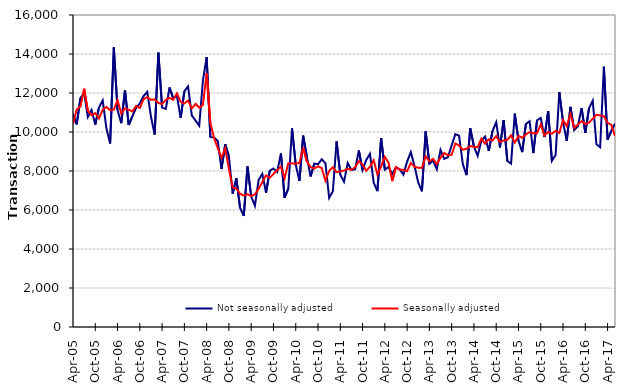
| Category | Not seasonally adjusted | Seasonally adjusted |
|---|---|---|
| 2005-04-01 | 10920 | 10410 |
| 2005-05-01 | 10390 | 11160 |
| 2005-06-01 | 11740 | 11300 |
| 2005-07-01 | 12000 | 12220 |
| 2005-08-01 | 10770 | 11090 |
| 2005-09-01 | 11130 | 10860 |
| 2005-10-01 | 10380 | 10970 |
| 2005-11-01 | 11260 | 10700 |
| 2005-12-01 | 11620 | 11140 |
| 2006-01-01 | 10190 | 11280 |
| 2006-02-01 | 9410 | 11120 |
| 2006-03-01 | 14330 | 11150 |
| 2006-04-01 | 11120 | 11630 |
| 2006-05-01 | 10450 | 10940 |
| 2006-06-01 | 12150 | 11210 |
| 2006-07-01 | 10360 | 11140 |
| 2006-08-01 | 10810 | 11050 |
| 2006-09-01 | 11230 | 11340 |
| 2006-10-01 | 11470 | 11230 |
| 2006-11-01 | 11840 | 11680 |
| 2006-12-01 | 12060 | 11790 |
| 2007-01-01 | 10790 | 11650 |
| 2007-02-01 | 9870 | 11670 |
| 2007-03-01 | 14070 | 11490 |
| 2007-04-01 | 11250 | 11430 |
| 2007-05-01 | 11180 | 11650 |
| 2007-06-01 | 12280 | 11750 |
| 2007-07-01 | 11720 | 11650 |
| 2007-08-01 | 11860 | 11980 |
| 2007-09-01 | 10720 | 11550 |
| 2007-10-01 | 12090 | 11470 |
| 2007-11-01 | 12340 | 11610 |
| 2007-12-01 | 10850 | 11210 |
| 2008-01-01 | 10590 | 11440 |
| 2008-02-01 | 10320 | 11250 |
| 2008-03-01 | 12640 | 11390 |
| 2008-04-01 | 13850 | 13010 |
| 2008-05-01 | 9750 | 10470 |
| 2008-06-01 | 9720 | 9690 |
| 2008-07-01 | 9540 | 9160 |
| 2008-08-01 | 8100 | 8680 |
| 2008-09-01 | 9380 | 9160 |
| 2008-10-01 | 8740 | 8110 |
| 2008-11-01 | 6840 | 7160 |
| 2008-12-01 | 7620 | 7100 |
| 2009-01-01 | 6110 | 6830 |
| 2009-02-01 | 5700 | 6740 |
| 2009-03-01 | 8230 | 6810 |
| 2009-04-01 | 6690 | 6710 |
| 2009-05-01 | 6220 | 6800 |
| 2009-06-01 | 7540 | 7090 |
| 2009-07-01 | 7850 | 7430 |
| 2009-08-01 | 6880 | 7780 |
| 2009-09-01 | 8010 | 7650 |
| 2009-10-01 | 8130 | 7850 |
| 2009-11-01 | 7950 | 8040 |
| 2009-12-01 | 8900 | 8220 |
| 2010-01-01 | 6630 | 7630 |
| 2010-02-01 | 7100 | 8400 |
| 2010-03-01 | 10190 | 8390 |
| 2010-04-01 | 8320 | 8370 |
| 2010-05-01 | 7490 | 8420 |
| 2010-06-01 | 9810 | 9190 |
| 2010-07-01 | 8720 | 8490 |
| 2010-08-01 | 7720 | 8200 |
| 2010-09-01 | 8380 | 8130 |
| 2010-10-01 | 8350 | 8240 |
| 2010-11-01 | 8600 | 8150 |
| 2010-12-01 | 8400 | 7500 |
| 2011-01-01 | 6620 | 8010 |
| 2011-02-01 | 6960 | 8190 |
| 2011-03-01 | 9520 | 7940 |
| 2011-04-01 | 7810 | 7980 |
| 2011-05-01 | 7450 | 8020 |
| 2011-06-01 | 8410 | 8120 |
| 2011-07-01 | 8050 | 8060 |
| 2011-08-01 | 8090 | 8190 |
| 2011-09-01 | 9050 | 8500 |
| 2011-10-01 | 8050 | 8330 |
| 2011-11-01 | 8570 | 8010 |
| 2011-12-01 | 8880 | 8220 |
| 2012-01-01 | 7400 | 8550 |
| 2012-02-01 | 6970 | 7820 |
| 2012-03-01 | 9690 | 8230 |
| 2012-04-01 | 8070 | 8730 |
| 2012-05-01 | 8200 | 8420 |
| 2012-06-01 | 7850 | 7480 |
| 2012-07-01 | 8190 | 8200 |
| 2012-08-01 | 8090 | 8070 |
| 2012-09-01 | 7810 | 8060 |
| 2012-10-01 | 8480 | 7990 |
| 2012-11-01 | 8970 | 8410 |
| 2012-12-01 | 8250 | 8210 |
| 2013-01-01 | 7400 | 8170 |
| 2013-02-01 | 6960 | 8160 |
| 2013-03-01 | 10030 | 8750 |
| 2013-04-01 | 8370 | 8500 |
| 2013-05-01 | 8530 | 8620 |
| 2013-06-01 | 8090 | 8350 |
| 2013-07-01 | 9080 | 8680 |
| 2013-08-01 | 8620 | 8920 |
| 2013-09-01 | 8710 | 8810 |
| 2013-10-01 | 9320 | 8830 |
| 2013-11-01 | 9890 | 9410 |
| 2013-12-01 | 9810 | 9300 |
| 2014-01-01 | 8360 | 9090 |
| 2014-02-01 | 7790 | 9140 |
| 2014-03-01 | 10200 | 9280 |
| 2014-04-01 | 9260 | 9240 |
| 2014-05-01 | 8780 | 9220 |
| 2014-06-01 | 9550 | 9660 |
| 2014-07-01 | 9770 | 9400 |
| 2014-08-01 | 9030 | 9630 |
| 2014-09-01 | 10050 | 9560 |
| 2014-10-01 | 10500 | 9790 |
| 2014-11-01 | 9210 | 9480 |
| 2014-12-01 | 10610 | 9560 |
| 2015-01-01 | 8510 | 9600 |
| 2015-02-01 | 8380 | 9830 |
| 2015-03-01 | 10940 | 9460 |
| 2015-04-01 | 9560 | 9800 |
| 2015-05-01 | 8970 | 9700 |
| 2015-06-01 | 10410 | 9880 |
| 2015-07-01 | 10550 | 9990 |
| 2015-08-01 | 8920 | 9940 |
| 2015-09-01 | 10600 | 9940 |
| 2015-10-01 | 10720 | 10390 |
| 2015-11-01 | 9740 | 9820 |
| 2015-12-01 | 11070 | 10000 |
| 2016-01-01 | 8520 | 9910 |
| 2016-02-01 | 8820 | 10060 |
| 2016-03-01 | 12040 | 9950 |
| 2016-04-01 | 10520 | 10610 |
| 2016-05-01 | 9540 | 10310 |
| 2016-06-01 | 11290 | 10930 |
| 2016-07-01 | 10100 | 10210 |
| 2016-08-01 | 10290 | 10380 |
| 2016-09-01 | 11230 | 10550 |
| 2016-10-01 | 9950 | 10410 |
| 2016-11-01 | 11220 | 10480 |
| 2016-12-01 | 11610 | 10680 |
| 2017-01-01 | 9370 | 10880 |
| 2017-02-01 | 9220 | 10850 |
| 2017-03-01 | 13350 | 10810 |
| 2017-04-01 | 9610 | 10470 |
| 2017-05-01 | 10050 | 10370 |
| 2017-06-01 | 10430 | 9800 |